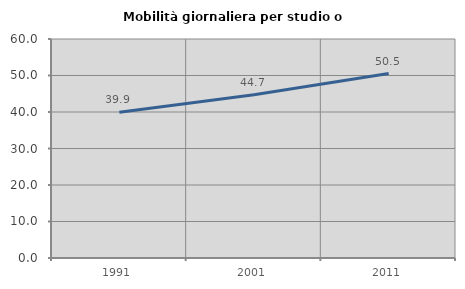
| Category | Mobilità giornaliera per studio o lavoro |
|---|---|
| 1991.0 | 39.915 |
| 2001.0 | 44.741 |
| 2011.0 | 50.538 |